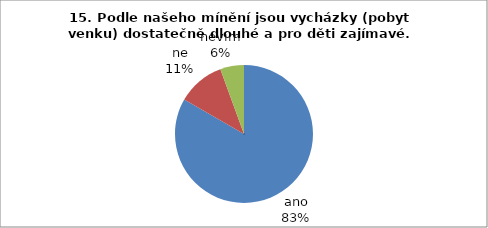
| Category | 15. |
|---|---|
| ano | 45 |
| ne | 6 |
| nevím | 3 |